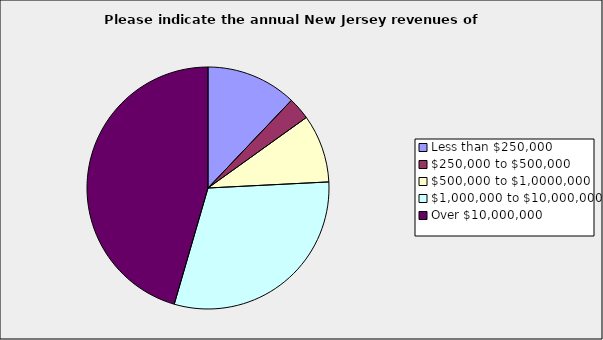
| Category | Series 0 |
|---|---|
| Less than $250,000 | 0.121 |
| $250,000 to $500,000 | 0.03 |
| $500,000 to $1,0000,000 | 0.091 |
| $1,000,000 to $10,000,000 | 0.303 |
| Over $10,000,000 | 0.455 |